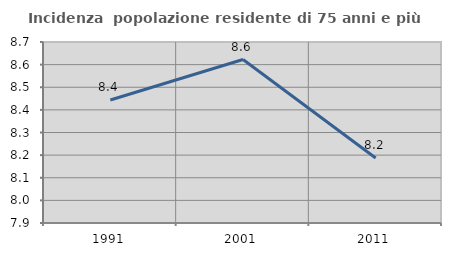
| Category | Incidenza  popolazione residente di 75 anni e più |
|---|---|
| 1991.0 | 8.444 |
| 2001.0 | 8.622 |
| 2011.0 | 8.188 |